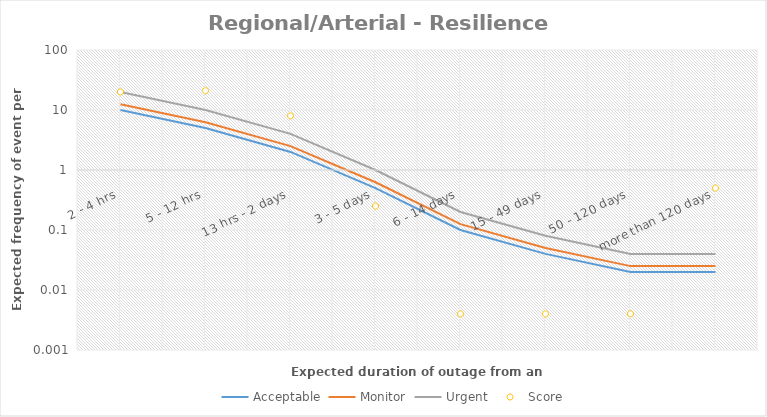
| Category | Acceptable | Monitor | Urgent | Score |
|---|---|---|---|---|
| 2 - 4 hrs | 10 | 12.5 | 20 | 20 |
| 5 - 12 hrs | 5 | 6.25 | 10 | 21 |
| 13 hrs - 2 days | 2 | 2.5 | 4 | 8 |
| 3 - 5 days | 0.5 | 0.625 | 1 | 0.25 |
| 6 - 14 days | 0.1 | 0.125 | 0.2 | 0.004 |
| 15 - 49 days | 0.04 | 0.05 | 0.08 | 0.004 |
| 50 - 120 days | 0.02 | 0.025 | 0.04 | 0.004 |
| more than 120 days | 0.02 | 0.025 | 0.04 | 0.5 |